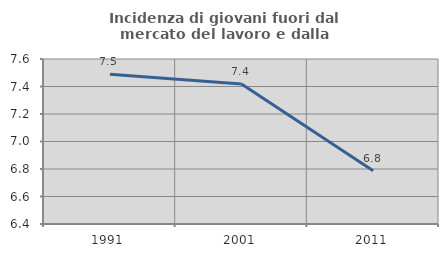
| Category | Incidenza di giovani fuori dal mercato del lavoro e dalla formazione  |
|---|---|
| 1991.0 | 7.489 |
| 2001.0 | 7.419 |
| 2011.0 | 6.788 |